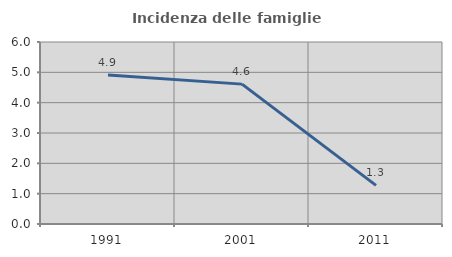
| Category | Incidenza delle famiglie numerose |
|---|---|
| 1991.0 | 4.914 |
| 2001.0 | 4.611 |
| 2011.0 | 1.272 |